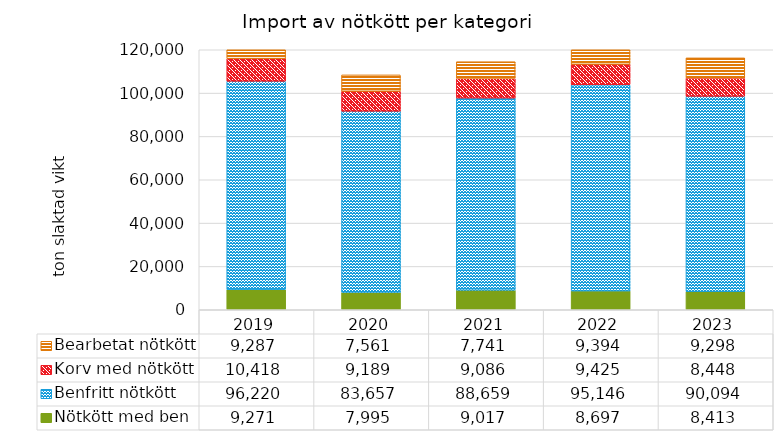
| Category | Nötkött med ben | Benfritt nötkött | Korv med nötkött | Bearbetat nötkött |
|---|---|---|---|---|
| 2019 | 9271 | 96220 | 10418.4 | 9286.857 |
| 2020 | 7995 | 83657.143 | 9189 | 7561.143 |
| 2021 | 9017 | 88658.571 | 9086.4 | 7740.571 |
| 2022 | 8697 | 95145.714 | 9425.4 | 9394.286 |
| 2023 | 8413 | 90094.286 | 8448 | 9298.286 |